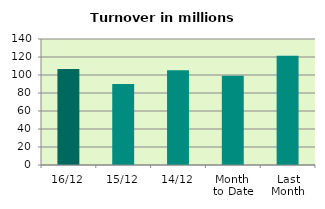
| Category | Series 0 |
|---|---|
| 16/12 | 106.534 |
| 15/12 | 89.975 |
| 14/12 | 105.178 |
| Month 
to Date | 99.085 |
| Last
Month | 121.455 |